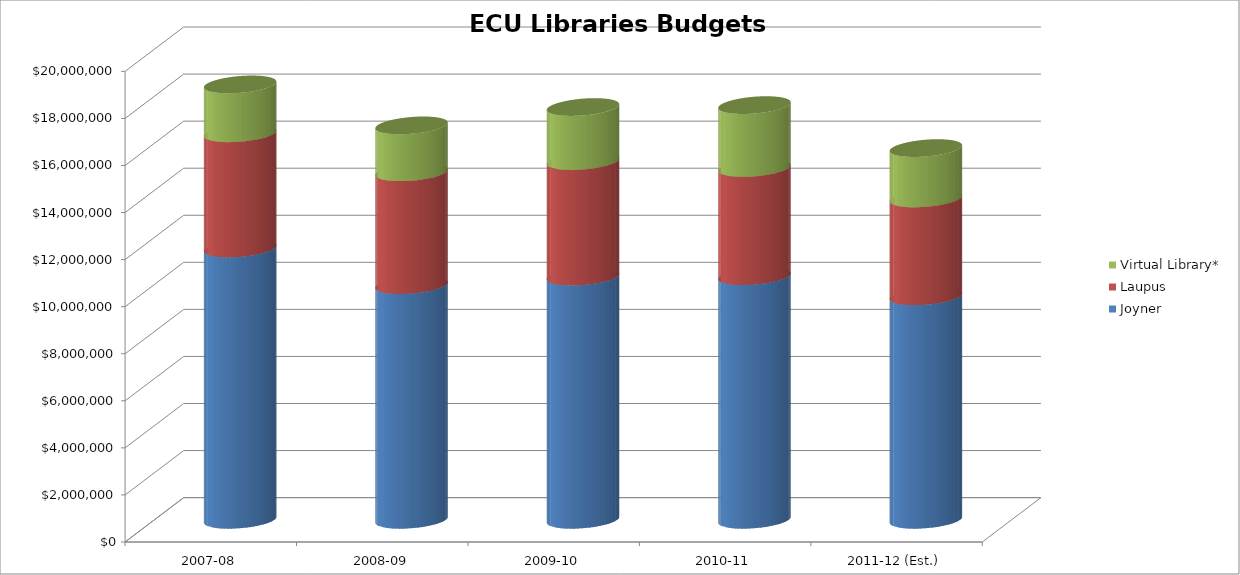
| Category | Joyner | Laupus | Virtual Library* |
|---|---|---|---|
| 2007-08 | 11534171 | 4892664 | 2075539 |
| 2008-09 | 9975544 | 4796687 | 1989684 |
| 2009-10 | 10339595 | 4905520 | 2296633 |
| 2010-11 | 10355792 | 4598339 | 2669679 |
| 2011-12 (Est.) | 9501615 | 4159393 | 2135743 |